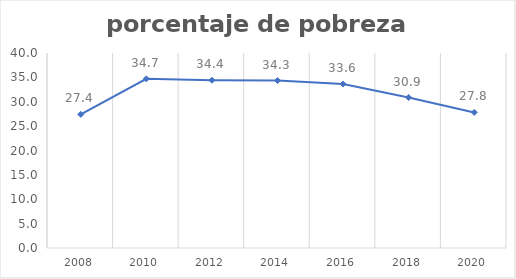
| Category | Series 0 |
|---|---|
| 2008.0 | 27.41 |
| 2010.0 | 34.693 |
| 2012.0 | 34.416 |
| 2014.0 | 34.346 |
| 2016.0 | 33.632 |
| 2018.0 | 30.869 |
| 2020.0 | 27.812 |